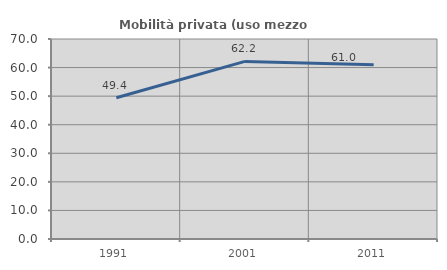
| Category | Mobilità privata (uso mezzo privato) |
|---|---|
| 1991.0 | 49.429 |
| 2001.0 | 62.159 |
| 2011.0 | 61.028 |